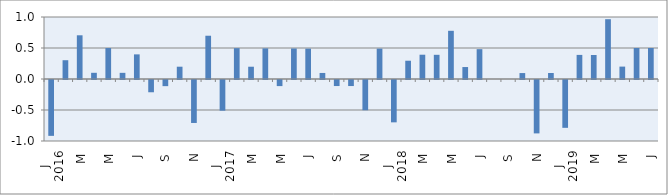
| Category | Series 0 |
|---|---|
| 0 | -0.901 |
| 1 | 0.303 |
| 2 | 0.705 |
| 3 | 0.1 |
| 4 | 0.5 |
| 5 | 0.099 |
| 6 | 0.397 |
| 7 | -0.198 |
| 8 | -0.099 |
| 9 | 0.198 |
| 10 | -0.693 |
| 11 | 0.698 |
| 12 | -0.495 |
| 13 | 0.498 |
| 14 | 0.198 |
| 15 | 0.494 |
| 16 | -0.098 |
| 17 | 0.492 |
| 18 | 0.49 |
| 19 | 0.097 |
| 20 | -0.097 |
| 21 | -0.097 |
| 22 | -0.488 |
| 23 | 0.49 |
| 24 | -0.683 |
| 25 | 0.295 |
| 26 | 0.392 |
| 27 | 0.39 |
| 28 | 0.777 |
| 29 | 0.193 |
| 30 | 0.481 |
| 31 | 0 |
| 32 | 0 |
| 33 | 0.096 |
| 34 | -0.861 |
| 35 | 0.097 |
| 36 | -0.771 |
| 37 | 0.389 |
| 38 | 0.387 |
| 39 | 0.964 |
| 40 | 0.2 |
| 41 | 0.5 |
| 42 | 0.5 |